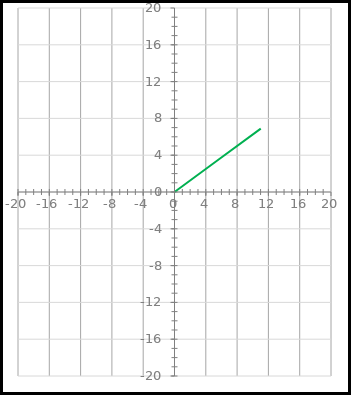
| Category | Vetor A |
|---|---|
| 0.0 | 0 |
| 11.024625250021037 | 6.889 |